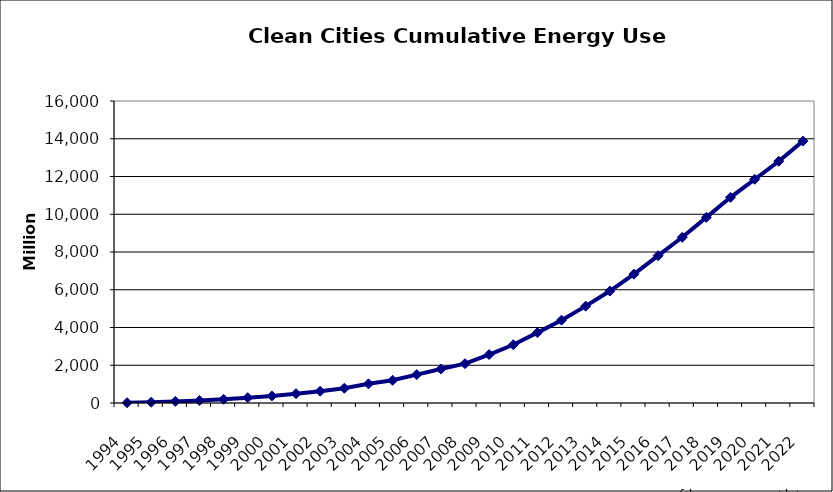
| Category | Series 0 |
|---|---|
| 1994.0 | 14.662 |
| 1995.0 | 40.919 |
| 1996.0 | 85.555 |
| 1997.0 | 128.157 |
| 1998.0 | 195.587 |
| 1999.0 | 282.58 |
| 2000.0 | 374.642 |
| 2001.0 | 493.822 |
| 2002.0 | 626.383 |
| 2003.0 | 782.437 |
| 2004.0 | 1015.437 |
| 2005.0 | 1202.337 |
| 2006.0 | 1504.337 |
| 2007.0 | 1798.337 |
| 2008.0 | 2085.337 |
| 2009.0 | 2567.337 |
| 2010.0 | 3086.837 |
| 2011.0 | 3727.837 |
| 2012.0 | 4389.237 |
| 2013.0 | 5130.837 |
| 2014.0 | 5930.337 |
| 2015.0 | 6827.737 |
| 2016.0 | 7805.937 |
| 2017.0 | 8778.537 |
| 2018.0 | 9834.837 |
| 2019.0 | 10898.037 |
| 2020.0 | 11853.037 |
| 2021.0 | 12808.737 |
| 2022.0 | 13874.737 |